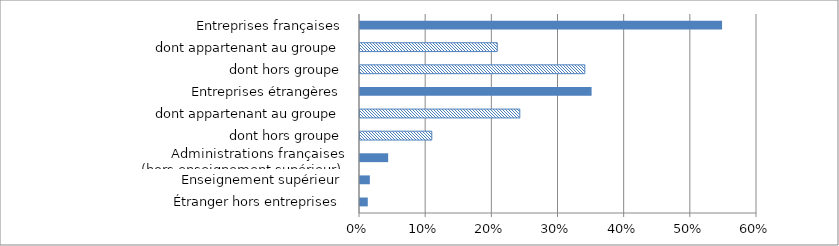
| Category | Series 0 |
|---|---|
| Étranger hors entreprises | 0.012 |
| Enseignement supérieur | 0.015 |
| Administrations françaises (hors enseignement supérieur) | 0.043 |
| dont hors groupe | 0.108 |
| dont appartenant au groupe | 0.242 |
| Entreprises étrangères | 0.35 |
| dont hors groupe | 0.34 |
| dont appartenant au groupe | 0.207 |
| Entreprises françaises | 0.547 |